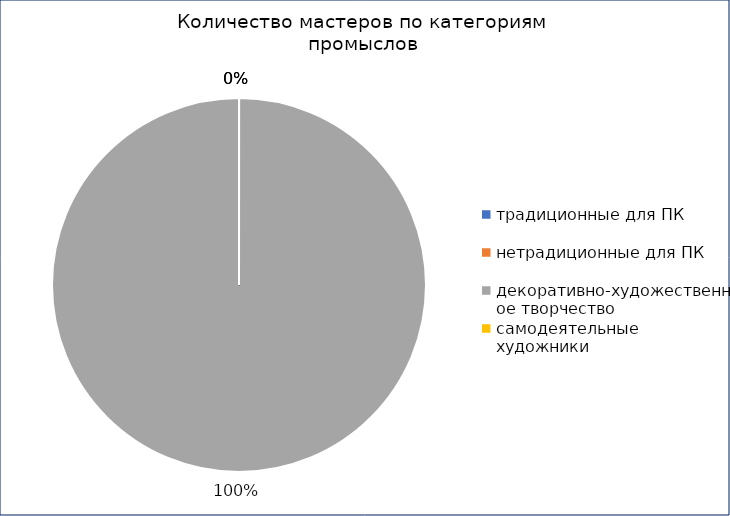
| Category | Количество |
|---|---|
| традиционные для ПК | 0 |
| нетрадиционные для ПК | 0 |
| декоративно-художественное творчество | 1 |
| самодеятельные художники | 0 |